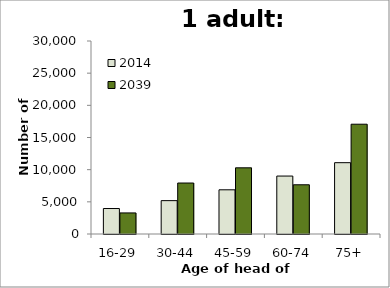
| Category | 2014 | 2039 |
|---|---|---|
| 16-29 | 3961 | 3275 |
| 30-44 | 5186 | 7925 |
| 45-59 | 6870 | 10286 |
| 60-74 | 9006 | 7653 |
| 75+ | 11086 | 17066 |